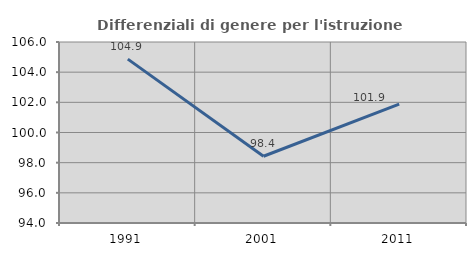
| Category | Differenziali di genere per l'istruzione superiore |
|---|---|
| 1991.0 | 104.866 |
| 2001.0 | 98.427 |
| 2011.0 | 101.886 |